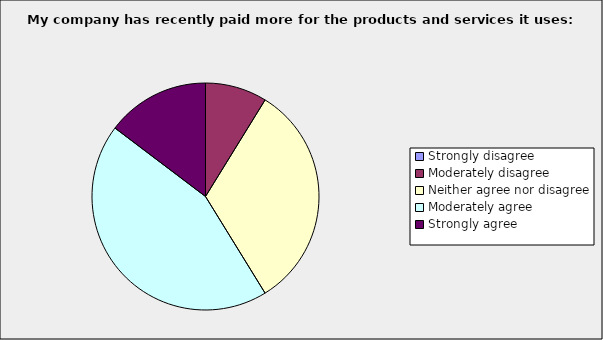
| Category | Series 0 |
|---|---|
| Strongly disagree | 0 |
| Moderately disagree | 0.088 |
| Neither agree nor disagree | 0.324 |
| Moderately agree | 0.441 |
| Strongly agree | 0.147 |